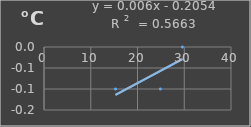
| Category | Temperatura |
|---|---|
| 15.3 | -0.1 |
| 24.9 | -0.1 |
| 29.6 | 0 |